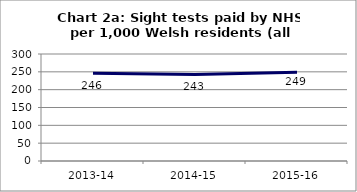
| Category | Chart 2a: Sight tests paid by NHS per 1,000 Welsh residents (all ages) |
|---|---|
| 2013-14 | 246.097 |
| 2014-15 | 242.638 |
| 2015-16 | 248.826 |